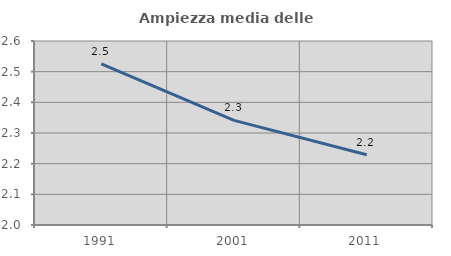
| Category | Ampiezza media delle famiglie |
|---|---|
| 1991.0 | 2.526 |
| 2001.0 | 2.341 |
| 2011.0 | 2.229 |